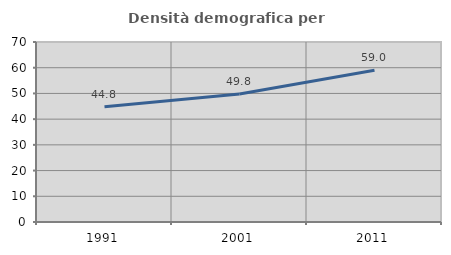
| Category | Densità demografica |
|---|---|
| 1991.0 | 44.815 |
| 2001.0 | 49.8 |
| 2011.0 | 58.994 |